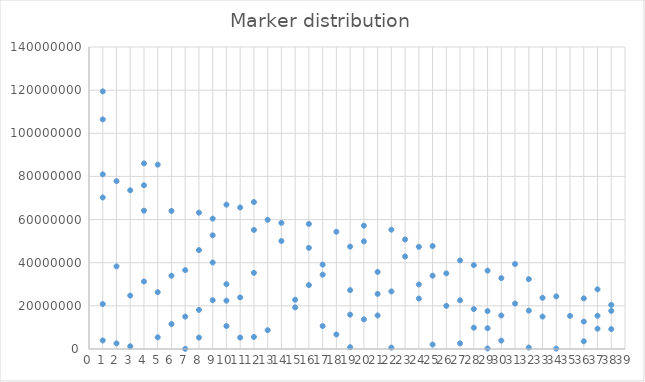
| Category | Series 0 |
|---|---|
| 1.0 | 3962719 |
| 1.0 | 20842130 |
| 1.0 | 70238933 |
| 1.0 | 80971770 |
| 1.0 | 106430955 |
| 1.0 | 119414584 |
| 2.0 | 2610859 |
| 2.0 | 38293797 |
| 2.0 | 77806065 |
| 3.0 | 1252765 |
| 3.0 | 24757939 |
| 3.0 | 73570828 |
| 4.0 | 31301072 |
| 4.0 | 64121754 |
| 4.0 | 75910211 |
| 4.0 | 86049027 |
| 5.0 | 5410890 |
| 5.0 | 26320165 |
| 5.0 | 85451804 |
| 6.0 | 11553458 |
| 6.0 | 33976751 |
| 6.0 | 64006720 |
| 7.0 | 76294 |
| 7.0 | 15011628 |
| 7.0 | 36555518 |
| 8.0 | 5291824 |
| 8.0 | 18121580 |
| 8.0 | 45852939 |
| 8.0 | 63196958 |
| 9.0 | 22610227 |
| 9.0 | 40096141 |
| 9.0 | 52710991 |
| 9.0 | 60437147 |
| 10.0 | 10652659 |
| 10.0 | 22409408 |
| 10.0 | 30034450 |
| 10.0 | 66922269 |
| 11.0 | 5318488 |
| 11.0 | 23907101 |
| 11.0 | 65603333 |
| 12.0 | 5579055 |
| 12.0 | 35306641 |
| 12.0 | 55201839 |
| 12.0 | 68125319 |
| 13.0 | 8704192 |
| 13.0 | 59896033 |
| 14.0 | 50063321 |
| 14.0 | 58465266 |
| 15.0 | 19299365 |
| 15.0 | 22834903 |
| 16.0 | 29634940 |
| 16.0 | 46884446 |
| 16.0 | 57958947 |
| 17.0 | 10649078 |
| 17.0 | 34462308 |
| 17.0 | 39124697 |
| 18.0 | 6745949 |
| 18.0 | 54361347 |
| 19.0 | 841347 |
| 19.0 | 15926130 |
| 19.0 | 27288167 |
| 19.0 | 47470564 |
| 20.0 | 13740894 |
| 20.0 | 49900586 |
| 20.0 | 57167714 |
| 21.0 | 15558670 |
| 21.0 | 25537675 |
| 21.0 | 35719434 |
| 22.0 | 641125 |
| 22.0 | 26694580 |
| 22.0 | 55308193 |
| 23.0 | 42886681 |
| 23.0 | 50772488 |
| 24.0 | 23393510 |
| 24.0 | 29909901 |
| 24.0 | 47381908 |
| 25.0 | 2073511 |
| 25.0 | 33986348 |
| 25.0 | 47708600 |
| 26.0 | 20004896 |
| 26.0 | 35071515 |
| 27.0 | 2619058 |
| 27.0 | 22599860 |
| 27.0 | 41049333 |
| 28.0 | 9877730 |
| 28.0 | 18509221 |
| 28.0 | 38885325 |
| 29.0 | 251970 |
| 29.0 | 9625359 |
| 29.0 | 17561258 |
| 29.0 | 36319325 |
| 30.0 | 3896482 |
| 30.0 | 15542105 |
| 30.0 | 32852404 |
| 31.0 | 21068798 |
| 31.0 | 39391935 |
| 32.0 | 679380 |
| 32.0 | 17792284 |
| 32.0 | 32382778 |
| 33.0 | 15018500 |
| 33.0 | 23742061 |
| 34.0 | 195313 |
| 34.0 | 24396298 |
| 35.0 | 15345329 |
| 36.0 | 3565500 |
| 36.0 | 12714421 |
| 36.0 | 23459390 |
| 37.0 | 9398945 |
| 37.0 | 15436615 |
| 37.0 | 27667297 |
| 38.0 | 9224942 |
| 38.0 | 17657161 |
| 38.0 | 20441216 |